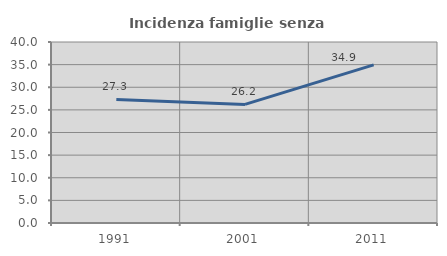
| Category | Incidenza famiglie senza nuclei |
|---|---|
| 1991.0 | 27.316 |
| 2001.0 | 26.202 |
| 2011.0 | 34.945 |